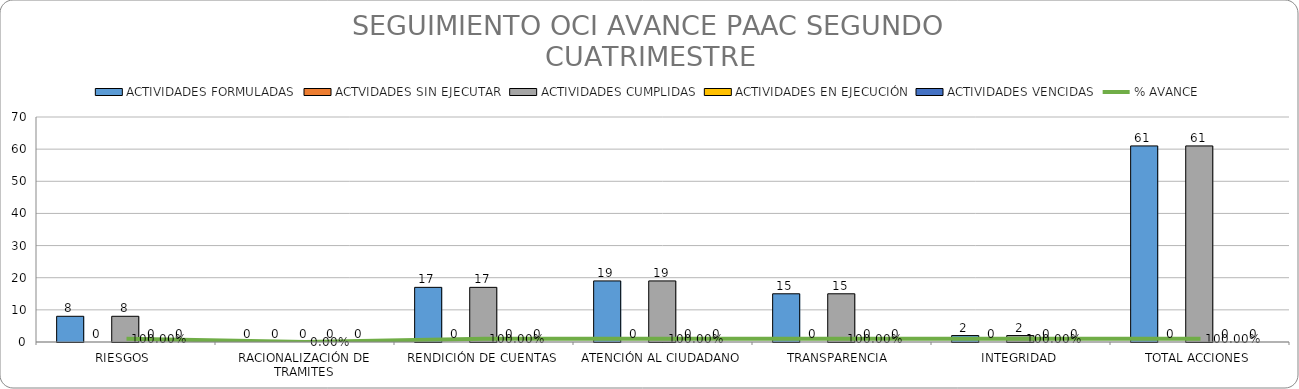
| Category | ACTIVIDADES FORMULADAS | ACTVIDADES SIN EJECUTAR | ACTIVIDADES CUMPLIDAS | ACTIVIDADES EN EJECUCIÓN | ACTIVIDADES VENCIDAS |
|---|---|---|---|---|---|
| RIESGOS  | 8 | 0 | 8 | 0 | 0 |
| RACIONALIZACIÓN DE TRAMITES | 0 | 0 | 0 | 0 | 0 |
| RENDICIÓN DE CUENTAS | 17 | 0 | 17 | 0 | 0 |
| ATENCIÓN AL CIUDADANO | 19 | 0 | 19 | 0 | 0 |
| TRANSPARENCIA  | 15 | 0 | 15 | 0 | 0 |
| INTEGRIDAD | 2 | 0 | 2 | 0 | 0 |
| TOTAL ACCIONES | 61 | 0 | 61 | 0 | 0 |